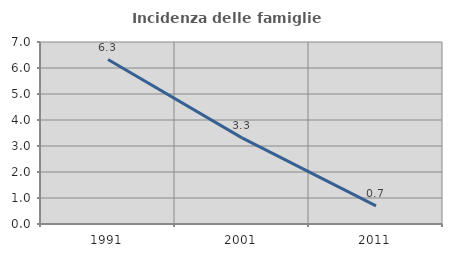
| Category | Incidenza delle famiglie numerose |
|---|---|
| 1991.0 | 6.324 |
| 2001.0 | 3.311 |
| 2011.0 | 0.694 |